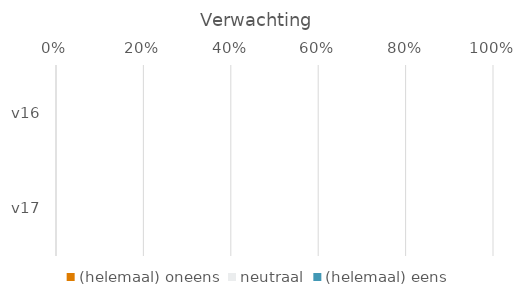
| Category | (helemaal) oneens | neutraal | (helemaal) eens |
|---|---|---|---|
| v16 | 0 | 0 | 0 |
| v17 | 0 | 0 | 0 |